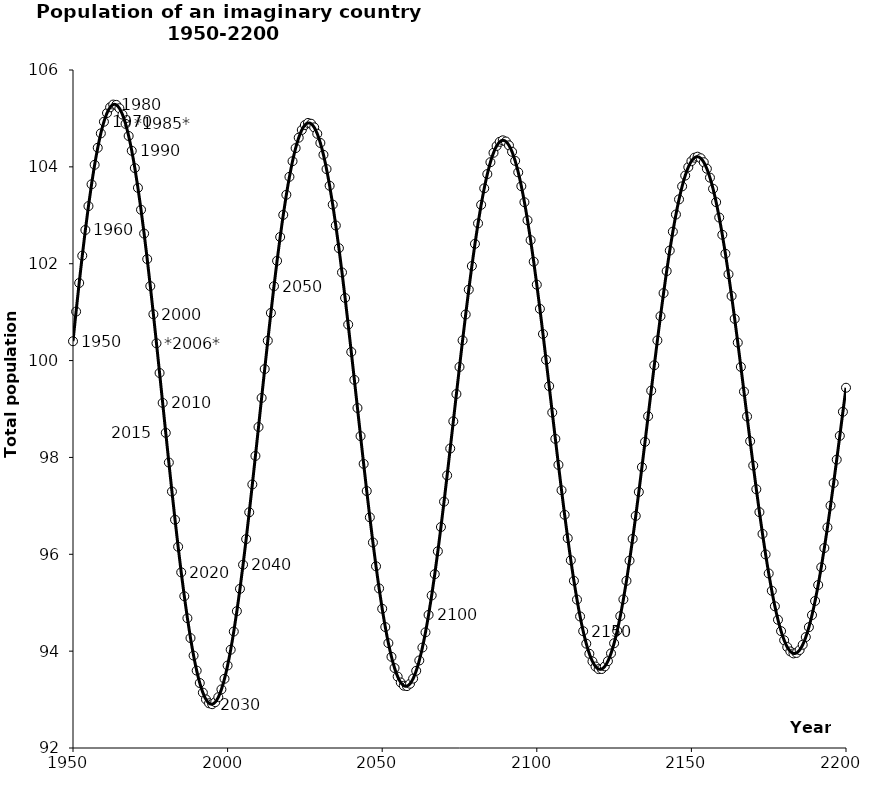
| Category | Series 0 |
|---|---|
| 1950.0 | 100.399 |
| 1951.0 | 101.011 |
| 1952.0 | 101.602 |
| 1953.0 | 102.166 |
| 1954.0 | 102.697 |
| 1955.0 | 103.189 |
| 1956.0 | 103.64 |
| 1957.0 | 104.042 |
| 1958.0 | 104.394 |
| 1959.0 | 104.691 |
| 1960.0 | 104.931 |
| 1961.0 | 105.111 |
| 1962.0 | 105.23 |
| 1963.0 | 105.286 |
| 1964.0 | 105.28 |
| 1965.0 | 105.21 |
| 1966.0 | 105.079 |
| 1967.0 | 104.888 |
| 1968.0 | 104.638 |
| 1969.0 | 104.332 |
| 1970.0 | 103.974 |
| 1971.0 | 103.567 |
| 1972.0 | 103.115 |
| 1973.0 | 102.622 |
| 1974.0 | 102.095 |
| 1975.0 | 101.538 |
| 1976.0 | 100.956 |
| 1977.0 | 100.356 |
| 1978.0 | 99.744 |
| 1979.0 | 99.126 |
| 1980.0 | 98.508 |
| 1981.0 | 97.895 |
| 1982.0 | 97.295 |
| 1983.0 | 96.714 |
| 1984.0 | 96.156 |
| 1985.0 | 95.628 |
| 1986.0 | 95.134 |
| 1987.0 | 94.68 |
| 1988.0 | 94.27 |
| 1989.0 | 93.908 |
| 1990.0 | 93.598 |
| 1991.0 | 93.342 |
| 1992.0 | 93.143 |
| 1993.0 | 93.003 |
| 1994.0 | 92.924 |
| 1995.0 | 92.905 |
| 1996.0 | 92.946 |
| 1997.0 | 93.049 |
| 1998.0 | 93.21 |
| 1999.0 | 93.429 |
| 2000.0 | 93.703 |
| 2001.0 | 94.03 |
| 2002.0 | 94.405 |
| 2003.0 | 94.826 |
| 2004.0 | 95.287 |
| 2005.0 | 95.784 |
| 2006.0 | 96.313 |
| 2007.0 | 96.867 |
| 2008.0 | 97.442 |
| 2009.0 | 98.031 |
| 2010.0 | 98.628 |
| 2011.0 | 99.228 |
| 2012.0 | 99.825 |
| 2013.0 | 100.412 |
| 2014.0 | 100.984 |
| 2015.0 | 101.535 |
| 2016.0 | 102.059 |
| 2017.0 | 102.552 |
| 2018.0 | 103.008 |
| 2019.0 | 103.424 |
| 2020.0 | 103.794 |
| 2021.0 | 104.116 |
| 2022.0 | 104.386 |
| 2023.0 | 104.602 |
| 2024.0 | 104.762 |
| 2025.0 | 104.864 |
| 2026.0 | 104.906 |
| 2027.0 | 104.89 |
| 2028.0 | 104.816 |
| 2029.0 | 104.683 |
| 2030.0 | 104.494 |
| 2031.0 | 104.25 |
| 2032.0 | 103.954 |
| 2033.0 | 103.61 |
| 2034.0 | 103.22 |
| 2035.0 | 102.789 |
| 2036.0 | 102.321 |
| 2037.0 | 101.82 |
| 2038.0 | 101.293 |
| 2039.0 | 100.743 |
| 2040.0 | 100.178 |
| 2041.0 | 99.602 |
| 2042.0 | 99.02 |
| 2043.0 | 98.44 |
| 2044.0 | 97.867 |
| 2045.0 | 97.306 |
| 2046.0 | 96.763 |
| 2047.0 | 96.244 |
| 2048.0 | 95.753 |
| 2049.0 | 95.295 |
| 2050.0 | 94.875 |
| 2051.0 | 94.498 |
| 2052.0 | 94.166 |
| 2053.0 | 93.883 |
| 2054.0 | 93.651 |
| 2055.0 | 93.474 |
| 2056.0 | 93.352 |
| 2057.0 | 93.287 |
| 2058.0 | 93.278 |
| 2059.0 | 93.327 |
| 2060.0 | 93.433 |
| 2061.0 | 93.594 |
| 2062.0 | 93.808 |
| 2063.0 | 94.074 |
| 2064.0 | 94.388 |
| 2065.0 | 94.748 |
| 2066.0 | 95.15 |
| 2067.0 | 95.589 |
| 2068.0 | 96.062 |
| 2069.0 | 96.563 |
| 2070.0 | 97.087 |
| 2071.0 | 97.629 |
| 2072.0 | 98.184 |
| 2073.0 | 98.746 |
| 2074.0 | 99.309 |
| 2075.0 | 99.868 |
| 2076.0 | 100.417 |
| 2077.0 | 100.951 |
| 2078.0 | 101.465 |
| 2079.0 | 101.953 |
| 2080.0 | 102.41 |
| 2081.0 | 102.833 |
| 2082.0 | 103.216 |
| 2083.0 | 103.556 |
| 2084.0 | 103.851 |
| 2085.0 | 104.096 |
| 2086.0 | 104.29 |
| 2087.0 | 104.431 |
| 2088.0 | 104.517 |
| 2089.0 | 104.548 |
| 2090.0 | 104.524 |
| 2091.0 | 104.444 |
| 2092.0 | 104.31 |
| 2093.0 | 104.124 |
| 2094.0 | 103.887 |
| 2095.0 | 103.601 |
| 2096.0 | 103.27 |
| 2097.0 | 102.897 |
| 2098.0 | 102.486 |
| 2099.0 | 102.041 |
| 2100.0 | 101.567 |
| 2101.0 | 101.068 |
| 2102.0 | 100.549 |
| 2103.0 | 100.016 |
| 2104.0 | 99.473 |
| 2105.0 | 98.927 |
| 2106.0 | 98.383 |
| 2107.0 | 97.846 |
| 2108.0 | 97.322 |
| 2109.0 | 96.816 |
| 2110.0 | 96.332 |
| 2111.0 | 95.876 |
| 2112.0 | 95.452 |
| 2113.0 | 95.064 |
| 2114.0 | 94.716 |
| 2115.0 | 94.412 |
| 2116.0 | 94.154 |
| 2117.0 | 93.946 |
| 2118.0 | 93.788 |
| 2119.0 | 93.682 |
| 2120.0 | 93.629 |
| 2121.0 | 93.631 |
| 2122.0 | 93.686 |
| 2123.0 | 93.794 |
| 2124.0 | 93.953 |
| 2125.0 | 94.163 |
| 2126.0 | 94.42 |
| 2127.0 | 94.723 |
| 2128.0 | 95.068 |
| 2129.0 | 95.452 |
| 2130.0 | 95.87 |
| 2131.0 | 96.318 |
| 2132.0 | 96.792 |
| 2133.0 | 97.288 |
| 2134.0 | 97.799 |
| 2135.0 | 98.322 |
| 2136.0 | 98.85 |
| 2137.0 | 99.379 |
| 2138.0 | 99.903 |
| 2139.0 | 100.417 |
| 2140.0 | 100.915 |
| 2141.0 | 101.394 |
| 2142.0 | 101.847 |
| 2143.0 | 102.272 |
| 2144.0 | 102.662 |
| 2145.0 | 103.016 |
| 2146.0 | 103.329 |
| 2147.0 | 103.597 |
| 2148.0 | 103.82 |
| 2149.0 | 103.994 |
| 2150.0 | 104.117 |
| 2151.0 | 104.19 |
| 2152.0 | 104.21 |
| 2153.0 | 104.178 |
| 2154.0 | 104.095 |
| 2155.0 | 103.961 |
| 2156.0 | 103.778 |
| 2157.0 | 103.547 |
| 2158.0 | 103.272 |
| 2159.0 | 102.954 |
| 2160.0 | 102.598 |
| 2161.0 | 102.206 |
| 2162.0 | 101.783 |
| 2163.0 | 101.333 |
| 2164.0 | 100.861 |
| 2165.0 | 100.371 |
| 2166.0 | 99.869 |
| 2167.0 | 99.358 |
| 2168.0 | 98.846 |
| 2169.0 | 98.335 |
| 2170.0 | 97.833 |
| 2171.0 | 97.343 |
| 2172.0 | 96.871 |
| 2173.0 | 96.42 |
| 2174.0 | 95.997 |
| 2175.0 | 95.604 |
| 2176.0 | 95.246 |
| 2177.0 | 94.926 |
| 2178.0 | 94.648 |
| 2179.0 | 94.413 |
| 2180.0 | 94.225 |
| 2181.0 | 94.085 |
| 2182.0 | 93.994 |
| 2183.0 | 93.953 |
| 2184.0 | 93.963 |
| 2185.0 | 94.023 |
| 2186.0 | 94.133 |
| 2187.0 | 94.29 |
| 2188.0 | 94.495 |
| 2189.0 | 94.744 |
| 2190.0 | 95.035 |
| 2191.0 | 95.366 |
| 2192.0 | 95.731 |
| 2193.0 | 96.129 |
| 2194.0 | 96.555 |
| 2195.0 | 97.004 |
| 2196.0 | 97.472 |
| 2197.0 | 97.954 |
| 2198.0 | 98.446 |
| 2199.0 | 98.943 |
| 2200.0 | 99.439 |